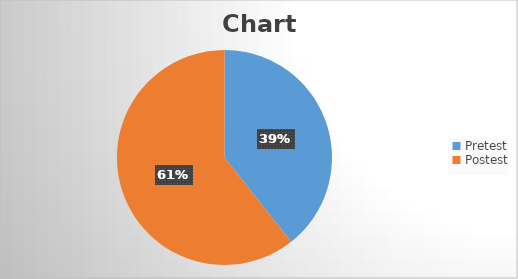
| Category | Series 0 |
|---|---|
| Pretest | 0.615 |
| Postest | 0.949 |